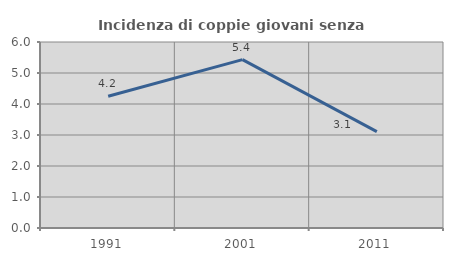
| Category | Incidenza di coppie giovani senza figli |
|---|---|
| 1991.0 | 4.249 |
| 2001.0 | 5.432 |
| 2011.0 | 3.109 |